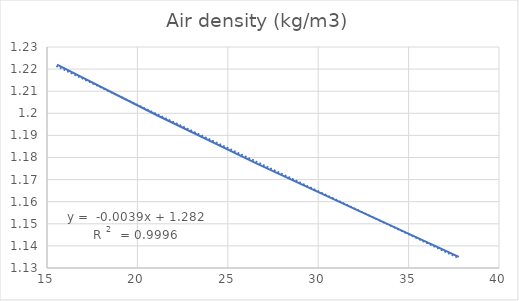
| Category | Air density (kg/m3) |
|---|---|
| 37.77777777777778 | 1.135 |
| 32.22222222222222 | 1.156 |
| 26.666666666666664 | 1.177 |
| 21.11111111111111 | 1.199 |
| 15.555555555555555 | 1.222 |